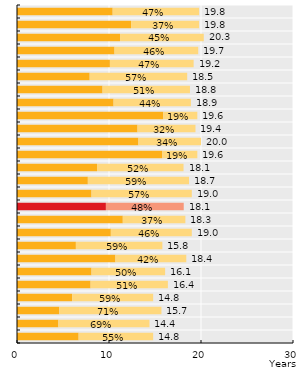
| Category | Healthy life years | Life expectancy with activity limitation | Series 0 |
|---|---|---|---|
| 0.47474747474747475 | 10.4 | 9.4 | 19.8 |
| 0.37373737373737376 | 12.4 | 7.4 | 19.8 |
| 0.4482758620689656 | 11.2 | 9.1 | 20.3 |
| 0.4619289340101523 | 10.6 | 9.1 | 19.7 |
| 0.4739583333333333 | 10.1 | 9.1 | 19.2 |
| 0.572972972972973 | 7.9 | 10.6 | 18.5 |
| 0.5053191489361702 | 9.3 | 9.5 | 18.8 |
| 0.4444444444444444 | 10.5 | 8.4 | 18.9 |
| 0.18877551020408168 | 15.9 | 3.7 | 19.6 |
| 0.32474226804123707 | 13.1 | 6.3 | 19.4 |
| 0.34 | 13.2 | 6.8 | 20 |
| 0.19387755102040818 | 15.8 | 3.8 | 19.6 |
| 0.5193370165745858 | 8.7 | 9.4 | 18.1 |
| 0.5882352941176471 | 7.7 | 11 | 18.7 |
| 0.5736842105263158 | 8.1 | 10.9 | 19 |
| 0.47510727007454534 | 9.664 | 8.46 | 18.124 |
| 0.37158469945355194 | 11.5 | 6.8 | 18.3 |
| 0.46315789473684216 | 10.2 | 8.8 | 19 |
| 0.5949367088607594 | 6.4 | 9.4 | 15.8 |
| 0.4184782608695652 | 10.7 | 7.7 | 18.4 |
| 0.49689440993788825 | 8.1 | 8 | 16.1 |
| 0.5121951219512195 | 8 | 8.4 | 16.4 |
| 0.5945945945945946 | 6 | 8.8 | 14.8 |
| 0.7070063694267515 | 4.6 | 11.1 | 15.7 |
| 0.6875 | 4.5 | 9.9 | 14.4 |
| 0.5472972972972974 | 6.7 | 8.1 | 14.8 |